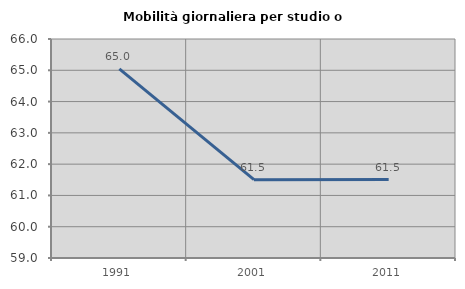
| Category | Mobilità giornaliera per studio o lavoro |
|---|---|
| 1991.0 | 65.046 |
| 2001.0 | 61.503 |
| 2011.0 | 61.509 |